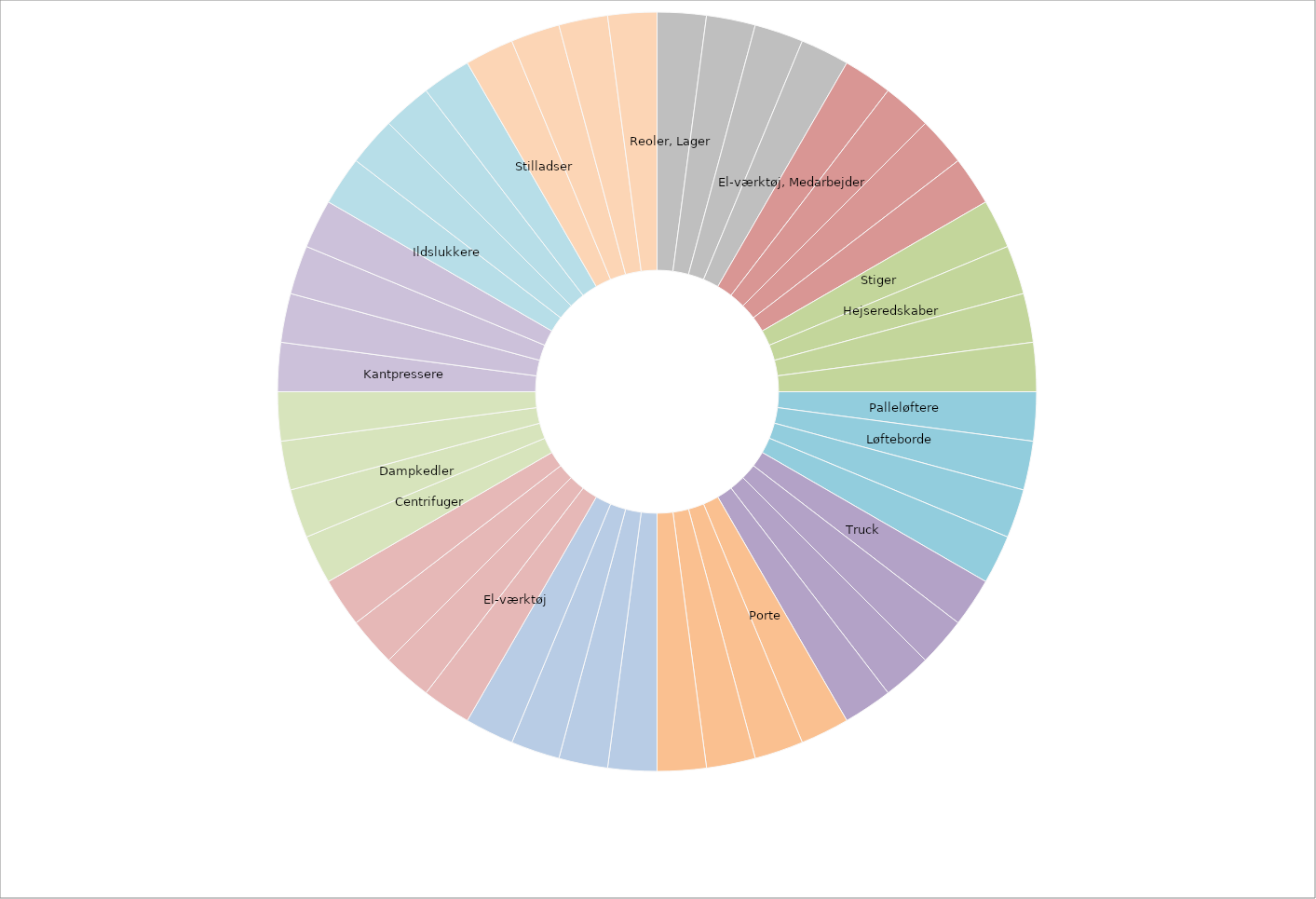
| Category | Series 0 |
|---|---|
| Reoler, Lager | 10 |
|  | 10 |
|  | 10 |
|  | 10 |
| El-værktøj, Medarbejder | 10 |
|  | 10 |
|  | 10 |
|  | 10 |
| Stiger | 10 |
| Hejseredskaber | 10 |
|  | 10 |
|  | 10 |
| Palleløftere | 10 |
| Løfteborde | 10 |
|  | 10 |
|  | 10 |
| Truck | 10 |
|  | 10 |
|  | 10 |
|  | 10 |
| Porte | 10 |
|  | 10 |
|  | 10 |
|  | 10 |
|  | 10 |
|  | 10 |
|  | 10 |
|  | 10 |
| El-værktøj | 10 |
|  | 10 |
|  | 10 |
|  | 10 |
| Centrifuger | 10 |
| Dampkedler | 10 |
|  | 10 |
|  | 10 |
| Kantpressere | 10 |
|  | 10 |
|  | 10 |
|  | 10 |
| Ildslukkere | 10 |
|  | 10 |
|  | 10 |
|  | 10 |
| Stilladser | 10 |